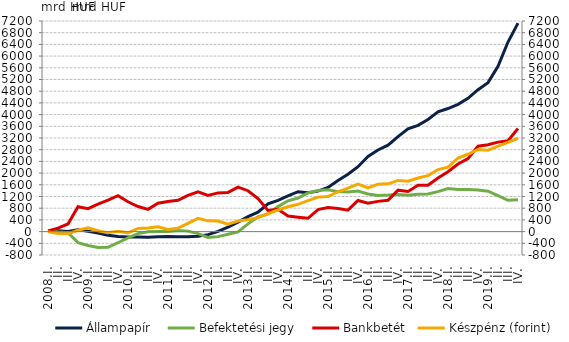
| Category | Állampapír  | Befektetési jegy  |
|---|---|---|
| 2008.I. | 22.215 | 26.165 |
| II. | 32.196 | -14.599 |
| III. | 3.655 | -38.376 |
| IV. | 58.993 | -379.05 |
| 2009.I. | 13.608 | -476.11 |
| II. | -50.936 | -540.979 |
| III. | -124.423 | -536.509 |
| IV. | -166.278 | -380.531 |
| 2010.I. | -187.825 | -213.951 |
| II. | -188.827 | -69.989 |
| III. | -192.032 | -3.064 |
| IV. | -177.74 | 5.307 |
| 2011.I. | -169.063 | 6.968 |
| II. | -175.678 | 38.963 |
| III. | -173.95 | 16.305 |
| IV. | -158.1 | -70.24 |
| 2012.I. | -104.526 | -202.446 |
| II. | 6.445 | -172.071 |
| III. | 148.428 | -89.3 |
| IV. | 326.618 | -10.203 |
| 2013.I. | 512.148 | 263.554 |
| II. | 662.178 | 506.175 |
| III. | 950.434 | 605.191 |
| IV. | 1068.977 | 855.499 |
| 2014.I. | 1219.915 | 1052.584 |
| II. | 1364.507 | 1146.502 |
| III. | 1327.264 | 1319.592 |
| IV. | 1382.463 | 1405.957 |
| 2015.I. | 1506.697 | 1429.501 |
| II. | 1746.659 | 1367.25 |
| III. | 1964.404 | 1354.616 |
| IV. | 2218.956 | 1387.636 |
| 2016.I. | 2567.788 | 1286.835 |
| II. | 2790.9 | 1238.377 |
| III. | 2955.272 | 1248.315 |
| IV. | 3246.51 | 1267.374 |
| 2017.I. | 3513.983 | 1241.208 |
| II. | 3631.932 | 1278.332 |
| III. | 3835.071 | 1284.224 |
| IV. | 4097.594 | 1367.164 |
| 2018.I. | 4208.093 | 1475.272 |
| II. | 4349.674 | 1443.063 |
| III. | 4554.519 | 1435.168 |
| IV. | 4852.016 | 1423.665 |
| 2019.I. | 5093.52 | 1382.389 |
| II. | 5651.77 | 1229.063 |
| III. | 6480.707 | 1069.987 |
| IV. | 7127.734 | 1088.141 |